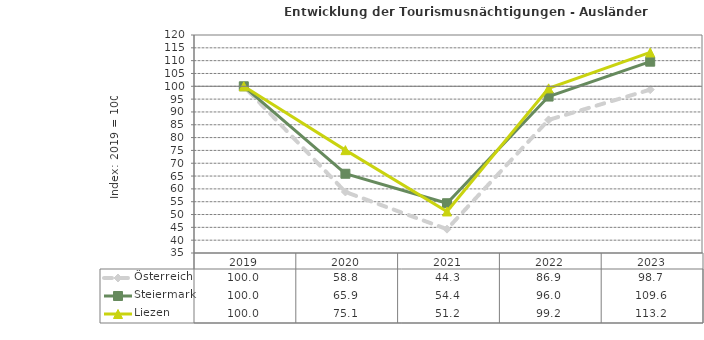
| Category | Österreich | Steiermark | Liezen |
|---|---|---|---|
| 2023.0 | 98.7 | 109.6 | 113.2 |
| 2022.0 | 86.9 | 96 | 99.2 |
| 2021.0 | 44.3 | 54.4 | 51.2 |
| 2020.0 | 58.8 | 65.9 | 75.1 |
| 2019.0 | 100 | 100 | 100 |